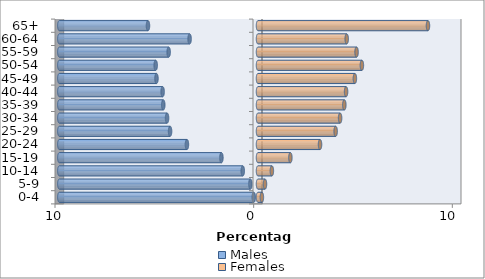
| Category | Males | Females |
|---|---|---|
| 0-4 | -0.212 | 0.195 |
| 5-9 | -0.383 | 0.352 |
| 10-14 | -0.767 | 0.698 |
| 15-19 | -1.842 | 1.63 |
| 20-24 | -3.577 | 3.122 |
| 25-29 | -4.426 | 3.908 |
| 30-34 | -4.578 | 4.132 |
| 35-39 | -4.768 | 4.346 |
| 40-44 | -4.801 | 4.434 |
| 45-49 | -5.111 | 4.877 |
| 50-54 | -5.15 | 5.23 |
| 55-59 | -4.497 | 4.961 |
| 60-64 | -3.443 | 4.465 |
| 65+ | -5.538 | 8.556 |